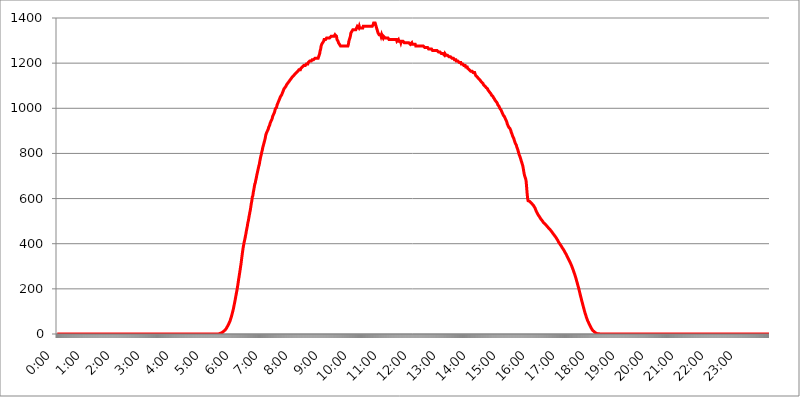
| Category | 2015.03.18. Intenzitás [W/m^2] |
|---|---|
| 0.0 | -0.256 |
| 0.0006944444444444445 | -0.256 |
| 0.001388888888888889 | -0.256 |
| 0.0020833333333333333 | -0.256 |
| 0.002777777777777778 | -0.256 |
| 0.003472222222222222 | -0.256 |
| 0.004166666666666667 | -0.256 |
| 0.004861111111111111 | -0.256 |
| 0.005555555555555556 | -0.256 |
| 0.0062499999999999995 | -0.256 |
| 0.006944444444444444 | -0.256 |
| 0.007638888888888889 | -0.256 |
| 0.008333333333333333 | -0.256 |
| 0.009027777777777779 | -0.256 |
| 0.009722222222222222 | -0.256 |
| 0.010416666666666666 | -0.256 |
| 0.011111111111111112 | -0.256 |
| 0.011805555555555555 | -0.256 |
| 0.012499999999999999 | -0.256 |
| 0.013194444444444444 | -0.256 |
| 0.013888888888888888 | -0.256 |
| 0.014583333333333332 | -0.256 |
| 0.015277777777777777 | -0.256 |
| 0.015972222222222224 | -0.256 |
| 0.016666666666666666 | -0.256 |
| 0.017361111111111112 | -0.256 |
| 0.018055555555555557 | -0.256 |
| 0.01875 | -0.256 |
| 0.019444444444444445 | -0.256 |
| 0.02013888888888889 | -0.256 |
| 0.020833333333333332 | -0.256 |
| 0.02152777777777778 | -0.256 |
| 0.022222222222222223 | -0.256 |
| 0.02291666666666667 | -0.256 |
| 0.02361111111111111 | -0.256 |
| 0.024305555555555556 | -0.256 |
| 0.024999999999999998 | -0.256 |
| 0.025694444444444447 | -0.256 |
| 0.02638888888888889 | -0.256 |
| 0.027083333333333334 | -0.256 |
| 0.027777777777777776 | -0.256 |
| 0.02847222222222222 | -0.256 |
| 0.029166666666666664 | -0.256 |
| 0.029861111111111113 | -0.256 |
| 0.030555555555555555 | -0.256 |
| 0.03125 | -0.256 |
| 0.03194444444444445 | -0.256 |
| 0.03263888888888889 | -0.256 |
| 0.03333333333333333 | -0.256 |
| 0.034027777777777775 | -0.256 |
| 0.034722222222222224 | -0.256 |
| 0.035416666666666666 | -0.256 |
| 0.036111111111111115 | -0.256 |
| 0.03680555555555556 | -0.256 |
| 0.0375 | -0.256 |
| 0.03819444444444444 | -0.256 |
| 0.03888888888888889 | -0.256 |
| 0.03958333333333333 | -0.256 |
| 0.04027777777777778 | -0.256 |
| 0.04097222222222222 | -0.256 |
| 0.041666666666666664 | -0.256 |
| 0.042361111111111106 | -0.256 |
| 0.04305555555555556 | -0.256 |
| 0.043750000000000004 | -0.256 |
| 0.044444444444444446 | -0.256 |
| 0.04513888888888889 | -0.256 |
| 0.04583333333333334 | -0.256 |
| 0.04652777777777778 | -0.256 |
| 0.04722222222222222 | -0.256 |
| 0.04791666666666666 | -0.256 |
| 0.04861111111111111 | -0.256 |
| 0.049305555555555554 | -0.256 |
| 0.049999999999999996 | -0.256 |
| 0.05069444444444445 | -0.256 |
| 0.051388888888888894 | -0.256 |
| 0.052083333333333336 | -0.256 |
| 0.05277777777777778 | -0.256 |
| 0.05347222222222222 | -0.256 |
| 0.05416666666666667 | -0.256 |
| 0.05486111111111111 | -0.256 |
| 0.05555555555555555 | -0.256 |
| 0.05625 | -0.256 |
| 0.05694444444444444 | -0.256 |
| 0.057638888888888885 | -0.256 |
| 0.05833333333333333 | -0.256 |
| 0.05902777777777778 | -0.256 |
| 0.059722222222222225 | -0.256 |
| 0.06041666666666667 | -0.256 |
| 0.061111111111111116 | -0.256 |
| 0.06180555555555556 | -0.256 |
| 0.0625 | -0.256 |
| 0.06319444444444444 | -0.256 |
| 0.06388888888888888 | -0.256 |
| 0.06458333333333334 | -0.256 |
| 0.06527777777777778 | -0.256 |
| 0.06597222222222222 | -0.256 |
| 0.06666666666666667 | -0.256 |
| 0.06736111111111111 | -0.256 |
| 0.06805555555555555 | -0.256 |
| 0.06874999999999999 | -0.256 |
| 0.06944444444444443 | -0.256 |
| 0.07013888888888889 | -0.256 |
| 0.07083333333333333 | -0.256 |
| 0.07152777777777779 | -0.256 |
| 0.07222222222222223 | -0.256 |
| 0.07291666666666667 | -0.256 |
| 0.07361111111111111 | -0.256 |
| 0.07430555555555556 | -0.256 |
| 0.075 | -0.256 |
| 0.07569444444444444 | -0.256 |
| 0.0763888888888889 | -0.256 |
| 0.07708333333333334 | -0.256 |
| 0.07777777777777778 | -0.256 |
| 0.07847222222222222 | -0.256 |
| 0.07916666666666666 | -0.256 |
| 0.0798611111111111 | -0.256 |
| 0.08055555555555556 | -0.256 |
| 0.08125 | -0.256 |
| 0.08194444444444444 | -0.256 |
| 0.08263888888888889 | -0.256 |
| 0.08333333333333333 | -0.256 |
| 0.08402777777777777 | -0.256 |
| 0.08472222222222221 | -0.256 |
| 0.08541666666666665 | -0.256 |
| 0.08611111111111112 | -0.256 |
| 0.08680555555555557 | -0.256 |
| 0.08750000000000001 | -0.256 |
| 0.08819444444444445 | -0.256 |
| 0.08888888888888889 | -0.256 |
| 0.08958333333333333 | -0.256 |
| 0.09027777777777778 | -0.256 |
| 0.09097222222222222 | -0.256 |
| 0.09166666666666667 | -0.256 |
| 0.09236111111111112 | -0.256 |
| 0.09305555555555556 | -0.256 |
| 0.09375 | -0.256 |
| 0.09444444444444444 | -0.256 |
| 0.09513888888888888 | -0.256 |
| 0.09583333333333333 | -0.256 |
| 0.09652777777777777 | -0.256 |
| 0.09722222222222222 | -0.256 |
| 0.09791666666666667 | -0.256 |
| 0.09861111111111111 | -0.256 |
| 0.09930555555555555 | -0.256 |
| 0.09999999999999999 | -0.256 |
| 0.10069444444444443 | -0.256 |
| 0.1013888888888889 | -0.256 |
| 0.10208333333333335 | -0.256 |
| 0.10277777777777779 | -0.256 |
| 0.10347222222222223 | -0.256 |
| 0.10416666666666667 | -0.256 |
| 0.10486111111111111 | -0.256 |
| 0.10555555555555556 | -0.256 |
| 0.10625 | -0.256 |
| 0.10694444444444444 | -0.256 |
| 0.1076388888888889 | -0.256 |
| 0.10833333333333334 | -0.256 |
| 0.10902777777777778 | -0.256 |
| 0.10972222222222222 | -0.256 |
| 0.1111111111111111 | -0.256 |
| 0.11180555555555556 | -0.256 |
| 0.11180555555555556 | -0.256 |
| 0.1125 | -0.256 |
| 0.11319444444444444 | -0.256 |
| 0.11388888888888889 | -0.256 |
| 0.11458333333333333 | -0.256 |
| 0.11527777777777777 | -0.256 |
| 0.11597222222222221 | -0.256 |
| 0.11666666666666665 | -0.256 |
| 0.1173611111111111 | -0.256 |
| 0.11805555555555557 | -0.256 |
| 0.11944444444444445 | -0.256 |
| 0.12013888888888889 | -0.256 |
| 0.12083333333333333 | -0.256 |
| 0.12152777777777778 | -0.256 |
| 0.12222222222222223 | -0.256 |
| 0.12291666666666667 | -0.256 |
| 0.12291666666666667 | -0.256 |
| 0.12361111111111112 | -0.256 |
| 0.12430555555555556 | -0.256 |
| 0.125 | -0.256 |
| 0.12569444444444444 | -0.256 |
| 0.12638888888888888 | -0.256 |
| 0.12708333333333333 | -0.256 |
| 0.16875 | -0.256 |
| 0.12847222222222224 | -0.256 |
| 0.12916666666666668 | -0.256 |
| 0.12986111111111112 | -0.256 |
| 0.13055555555555556 | -0.256 |
| 0.13125 | -0.256 |
| 0.13194444444444445 | -0.256 |
| 0.1326388888888889 | -0.256 |
| 0.13333333333333333 | -0.256 |
| 0.13402777777777777 | -0.256 |
| 0.13402777777777777 | -0.256 |
| 0.13472222222222222 | -0.256 |
| 0.13541666666666666 | -0.256 |
| 0.1361111111111111 | -0.256 |
| 0.13749999999999998 | -0.256 |
| 0.13819444444444443 | -0.256 |
| 0.1388888888888889 | -0.256 |
| 0.13958333333333334 | -0.256 |
| 0.14027777777777778 | -0.256 |
| 0.14097222222222222 | -0.256 |
| 0.14166666666666666 | -0.256 |
| 0.1423611111111111 | -0.256 |
| 0.14305555555555557 | -0.256 |
| 0.14375000000000002 | -0.256 |
| 0.14444444444444446 | -0.256 |
| 0.1451388888888889 | -0.256 |
| 0.1451388888888889 | -0.256 |
| 0.14652777777777778 | -0.256 |
| 0.14722222222222223 | -0.256 |
| 0.14791666666666667 | -0.256 |
| 0.1486111111111111 | -0.256 |
| 0.14930555555555555 | -0.256 |
| 0.15 | -0.256 |
| 0.15069444444444444 | -0.256 |
| 0.15138888888888888 | -0.256 |
| 0.15208333333333332 | -0.256 |
| 0.15277777777777776 | -0.256 |
| 0.15347222222222223 | -0.256 |
| 0.15416666666666667 | -0.256 |
| 0.15486111111111112 | -0.256 |
| 0.15555555555555556 | -0.256 |
| 0.15625 | -0.256 |
| 0.15694444444444444 | -0.256 |
| 0.15763888888888888 | -0.256 |
| 0.15833333333333333 | -0.256 |
| 0.15902777777777777 | -0.256 |
| 0.15972222222222224 | -0.256 |
| 0.16041666666666668 | -0.256 |
| 0.16111111111111112 | -0.256 |
| 0.16180555555555556 | -0.256 |
| 0.1625 | -0.256 |
| 0.16319444444444445 | -0.256 |
| 0.1638888888888889 | -0.256 |
| 0.16458333333333333 | -0.256 |
| 0.16527777777777777 | -0.256 |
| 0.16597222222222222 | -0.256 |
| 0.16666666666666666 | -0.256 |
| 0.1673611111111111 | -0.256 |
| 0.16805555555555554 | -0.256 |
| 0.16874999999999998 | -0.256 |
| 0.16944444444444443 | -0.256 |
| 0.17013888888888887 | -0.256 |
| 0.1708333333333333 | -0.256 |
| 0.17152777777777775 | -0.256 |
| 0.17222222222222225 | -0.256 |
| 0.1729166666666667 | -0.256 |
| 0.17361111111111113 | -0.256 |
| 0.17430555555555557 | -0.256 |
| 0.17500000000000002 | -0.256 |
| 0.17569444444444446 | -0.256 |
| 0.1763888888888889 | -0.256 |
| 0.17708333333333334 | -0.256 |
| 0.17777777777777778 | -0.256 |
| 0.17847222222222223 | -0.256 |
| 0.17916666666666667 | -0.256 |
| 0.1798611111111111 | -0.256 |
| 0.18055555555555555 | -0.256 |
| 0.18125 | -0.256 |
| 0.18194444444444444 | -0.256 |
| 0.1826388888888889 | -0.256 |
| 0.18333333333333335 | -0.256 |
| 0.1840277777777778 | -0.256 |
| 0.18472222222222223 | -0.256 |
| 0.18541666666666667 | -0.256 |
| 0.18611111111111112 | -0.256 |
| 0.18680555555555556 | -0.256 |
| 0.1875 | -0.256 |
| 0.18819444444444444 | -0.256 |
| 0.18888888888888888 | -0.256 |
| 0.18958333333333333 | -0.256 |
| 0.19027777777777777 | -0.256 |
| 0.1909722222222222 | -0.256 |
| 0.19166666666666665 | -0.256 |
| 0.19236111111111112 | -0.256 |
| 0.19305555555555554 | -0.256 |
| 0.19375 | -0.256 |
| 0.19444444444444445 | -0.256 |
| 0.1951388888888889 | -0.256 |
| 0.19583333333333333 | -0.256 |
| 0.19652777777777777 | -0.256 |
| 0.19722222222222222 | -0.256 |
| 0.19791666666666666 | -0.256 |
| 0.1986111111111111 | -0.256 |
| 0.19930555555555554 | -0.256 |
| 0.19999999999999998 | -0.256 |
| 0.20069444444444443 | -0.256 |
| 0.20138888888888887 | -0.256 |
| 0.2020833333333333 | -0.256 |
| 0.2027777777777778 | -0.256 |
| 0.2034722222222222 | -0.256 |
| 0.2041666666666667 | -0.256 |
| 0.20486111111111113 | -0.256 |
| 0.20555555555555557 | -0.256 |
| 0.20625000000000002 | -0.256 |
| 0.20694444444444446 | -0.256 |
| 0.2076388888888889 | -0.256 |
| 0.20833333333333334 | -0.256 |
| 0.20902777777777778 | -0.256 |
| 0.20972222222222223 | -0.256 |
| 0.21041666666666667 | -0.256 |
| 0.2111111111111111 | -0.256 |
| 0.21180555555555555 | -0.256 |
| 0.2125 | -0.256 |
| 0.21319444444444444 | -0.256 |
| 0.2138888888888889 | -0.256 |
| 0.21458333333333335 | -0.256 |
| 0.2152777777777778 | -0.256 |
| 0.21597222222222223 | -0.256 |
| 0.21666666666666667 | -0.256 |
| 0.21736111111111112 | -0.256 |
| 0.21805555555555556 | -0.256 |
| 0.21875 | -0.256 |
| 0.21944444444444444 | -0.256 |
| 0.22013888888888888 | -0.256 |
| 0.22083333333333333 | -0.256 |
| 0.22152777777777777 | -0.256 |
| 0.2222222222222222 | -0.256 |
| 0.22291666666666665 | -0.256 |
| 0.2236111111111111 | -0.256 |
| 0.22430555555555556 | -0.256 |
| 0.225 | -0.256 |
| 0.22569444444444445 | 1.09 |
| 0.2263888888888889 | 1.09 |
| 0.22708333333333333 | 1.09 |
| 0.22777777777777777 | 1.09 |
| 0.22847222222222222 | 2.439 |
| 0.22916666666666666 | 3.791 |
| 0.2298611111111111 | 3.791 |
| 0.23055555555555554 | 5.146 |
| 0.23124999999999998 | 6.503 |
| 0.23194444444444443 | 7.862 |
| 0.23263888888888887 | 9.225 |
| 0.2333333333333333 | 11.956 |
| 0.2340277777777778 | 13.325 |
| 0.2347222222222222 | 16.069 |
| 0.2354166666666667 | 17.444 |
| 0.23611111111111113 | 20.201 |
| 0.23680555555555557 | 22.965 |
| 0.23750000000000002 | 27.124 |
| 0.23819444444444446 | 31.297 |
| 0.2388888888888889 | 34.086 |
| 0.23958333333333334 | 38.28 |
| 0.24027777777777778 | 42.483 |
| 0.24097222222222223 | 48.1 |
| 0.24166666666666667 | 52.322 |
| 0.2423611111111111 | 57.958 |
| 0.24305555555555555 | 65.012 |
| 0.24375 | 72.069 |
| 0.24444444444444446 | 79.125 |
| 0.24513888888888888 | 87.583 |
| 0.24583333333333335 | 96.022 |
| 0.2465277777777778 | 104.435 |
| 0.24722222222222223 | 114.207 |
| 0.24791666666666667 | 125.304 |
| 0.24861111111111112 | 136.314 |
| 0.24930555555555556 | 147.223 |
| 0.25 | 159.364 |
| 0.25069444444444444 | 171.353 |
| 0.2513888888888889 | 183.184 |
| 0.2520833333333333 | 194.849 |
| 0.25277777777777777 | 207.615 |
| 0.2534722222222222 | 221.422 |
| 0.25416666666666665 | 237.433 |
| 0.2548611111111111 | 250.739 |
| 0.2555555555555556 | 265.034 |
| 0.25625000000000003 | 279.136 |
| 0.2569444444444445 | 294.255 |
| 0.2576388888888889 | 308.129 |
| 0.25833333333333336 | 325.473 |
| 0.2590277777777778 | 342.968 |
| 0.25972222222222224 | 359.595 |
| 0.2604166666666667 | 375.442 |
| 0.2611111111111111 | 389.27 |
| 0.26180555555555557 | 400.943 |
| 0.2625 | 411.638 |
| 0.26319444444444445 | 421.278 |
| 0.2638888888888889 | 432.656 |
| 0.26458333333333334 | 444.463 |
| 0.2652777777777778 | 456.747 |
| 0.2659722222222222 | 467.925 |
| 0.26666666666666666 | 479.541 |
| 0.2673611111111111 | 493.398 |
| 0.26805555555555555 | 502.396 |
| 0.26875 | 515.462 |
| 0.26944444444444443 | 527.122 |
| 0.2701388888888889 | 539.234 |
| 0.2708333333333333 | 549.691 |
| 0.27152777777777776 | 564.917 |
| 0.2722222222222222 | 578.542 |
| 0.27291666666666664 | 590.321 |
| 0.2736111111111111 | 607.495 |
| 0.2743055555555555 | 612.554 |
| 0.27499999999999997 | 628.152 |
| 0.27569444444444446 | 638.912 |
| 0.27638888888888885 | 652.786 |
| 0.27708333333333335 | 664.234 |
| 0.2777777777777778 | 670.078 |
| 0.27847222222222223 | 682.011 |
| 0.2791666666666667 | 691.18 |
| 0.2798611111111111 | 703.704 |
| 0.28055555555555556 | 713.328 |
| 0.28125 | 723.153 |
| 0.28194444444444444 | 733.184 |
| 0.2826388888888889 | 743.425 |
| 0.2833333333333333 | 750.371 |
| 0.28402777777777777 | 764.555 |
| 0.2847222222222222 | 775.451 |
| 0.28541666666666665 | 786.575 |
| 0.28611111111111115 | 794.119 |
| 0.28680555555555554 | 805.632 |
| 0.28750000000000003 | 813.439 |
| 0.2881944444444445 | 825.351 |
| 0.2888888888888889 | 829.377 |
| 0.28958333333333336 | 841.619 |
| 0.2902777777777778 | 849.92 |
| 0.29097222222222224 | 858.335 |
| 0.2916666666666667 | 866.865 |
| 0.2923611111111111 | 879.878 |
| 0.29305555555555557 | 884.274 |
| 0.29375 | 893.157 |
| 0.29444444444444445 | 893.157 |
| 0.2951388888888889 | 902.16 |
| 0.29583333333333334 | 906.707 |
| 0.2965277777777778 | 915.893 |
| 0.2972222222222222 | 920.533 |
| 0.29791666666666666 | 925.203 |
| 0.2986111111111111 | 934.639 |
| 0.29930555555555555 | 939.404 |
| 0.3 | 944.201 |
| 0.30069444444444443 | 949.03 |
| 0.3013888888888889 | 953.892 |
| 0.3020833333333333 | 963.712 |
| 0.30277777777777776 | 968.671 |
| 0.3034722222222222 | 973.663 |
| 0.30416666666666664 | 978.688 |
| 0.3048611111111111 | 983.747 |
| 0.3055555555555555 | 993.965 |
| 0.30624999999999997 | 999.125 |
| 0.3069444444444444 | 999.125 |
| 0.3076388888888889 | 1004.318 |
| 0.30833333333333335 | 1014.809 |
| 0.3090277777777778 | 1014.809 |
| 0.30972222222222223 | 1025.437 |
| 0.3104166666666667 | 1025.437 |
| 0.3111111111111111 | 1036.206 |
| 0.31180555555555556 | 1041.644 |
| 0.3125 | 1047.117 |
| 0.31319444444444444 | 1052.625 |
| 0.3138888888888889 | 1052.625 |
| 0.3145833333333333 | 1058.17 |
| 0.31527777777777777 | 1063.751 |
| 0.3159722222222222 | 1069.368 |
| 0.31666666666666665 | 1075.021 |
| 0.31736111111111115 | 1080.711 |
| 0.31805555555555554 | 1086.439 |
| 0.31875000000000003 | 1086.439 |
| 0.3194444444444445 | 1092.203 |
| 0.3201388888888889 | 1092.203 |
| 0.32083333333333336 | 1098.004 |
| 0.3215277777777778 | 1103.843 |
| 0.32222222222222224 | 1103.843 |
| 0.3229166666666667 | 1109.72 |
| 0.3236111111111111 | 1109.72 |
| 0.32430555555555557 | 1115.634 |
| 0.325 | 1115.634 |
| 0.32569444444444445 | 1121.587 |
| 0.3263888888888889 | 1121.587 |
| 0.32708333333333334 | 1127.578 |
| 0.3277777777777778 | 1127.578 |
| 0.3284722222222222 | 1133.607 |
| 0.32916666666666666 | 1133.607 |
| 0.3298611111111111 | 1139.675 |
| 0.33055555555555555 | 1139.675 |
| 0.33125 | 1139.675 |
| 0.33194444444444443 | 1145.782 |
| 0.3326388888888889 | 1145.782 |
| 0.3333333333333333 | 1151.928 |
| 0.3340277777777778 | 1151.928 |
| 0.3347222222222222 | 1151.928 |
| 0.3354166666666667 | 1158.113 |
| 0.3361111111111111 | 1158.113 |
| 0.3368055555555556 | 1158.113 |
| 0.33749999999999997 | 1164.337 |
| 0.33819444444444446 | 1164.337 |
| 0.33888888888888885 | 1170.601 |
| 0.33958333333333335 | 1170.601 |
| 0.34027777777777773 | 1170.601 |
| 0.34097222222222223 | 1170.601 |
| 0.3416666666666666 | 1176.905 |
| 0.3423611111111111 | 1176.905 |
| 0.3430555555555555 | 1176.905 |
| 0.34375 | 1183.249 |
| 0.3444444444444445 | 1183.249 |
| 0.3451388888888889 | 1183.249 |
| 0.3458333333333334 | 1189.633 |
| 0.34652777777777777 | 1189.633 |
| 0.34722222222222227 | 1189.633 |
| 0.34791666666666665 | 1189.633 |
| 0.34861111111111115 | 1189.633 |
| 0.34930555555555554 | 1196.058 |
| 0.35000000000000003 | 1196.058 |
| 0.3506944444444444 | 1196.058 |
| 0.3513888888888889 | 1196.058 |
| 0.3520833333333333 | 1202.523 |
| 0.3527777777777778 | 1202.523 |
| 0.3534722222222222 | 1202.523 |
| 0.3541666666666667 | 1209.029 |
| 0.3548611111111111 | 1209.029 |
| 0.35555555555555557 | 1209.029 |
| 0.35625 | 1209.029 |
| 0.35694444444444445 | 1209.029 |
| 0.3576388888888889 | 1215.576 |
| 0.35833333333333334 | 1215.576 |
| 0.3590277777777778 | 1215.576 |
| 0.3597222222222222 | 1215.576 |
| 0.36041666666666666 | 1215.576 |
| 0.3611111111111111 | 1215.576 |
| 0.36180555555555555 | 1222.164 |
| 0.3625 | 1222.164 |
| 0.36319444444444443 | 1222.164 |
| 0.3638888888888889 | 1222.164 |
| 0.3645833333333333 | 1222.164 |
| 0.3652777777777778 | 1222.164 |
| 0.3659722222222222 | 1222.164 |
| 0.3666666666666667 | 1228.794 |
| 0.3673611111111111 | 1228.794 |
| 0.3680555555555556 | 1242.179 |
| 0.36874999999999997 | 1255.731 |
| 0.36944444444444446 | 1262.571 |
| 0.37013888888888885 | 1276.38 |
| 0.37083333333333335 | 1283.348 |
| 0.37152777777777773 | 1283.348 |
| 0.37222222222222223 | 1290.36 |
| 0.3729166666666666 | 1290.36 |
| 0.3736111111111111 | 1297.416 |
| 0.3743055555555555 | 1304.515 |
| 0.375 | 1304.515 |
| 0.3756944444444445 | 1304.515 |
| 0.3763888888888889 | 1304.515 |
| 0.3770833333333334 | 1304.515 |
| 0.37777777777777777 | 1311.658 |
| 0.37847222222222227 | 1311.658 |
| 0.37916666666666665 | 1311.658 |
| 0.37986111111111115 | 1311.658 |
| 0.38055555555555554 | 1311.658 |
| 0.38125000000000003 | 1311.658 |
| 0.3819444444444444 | 1311.658 |
| 0.3826388888888889 | 1311.658 |
| 0.3833333333333333 | 1311.658 |
| 0.3840277777777778 | 1318.845 |
| 0.3847222222222222 | 1318.845 |
| 0.3854166666666667 | 1318.845 |
| 0.3861111111111111 | 1318.845 |
| 0.38680555555555557 | 1318.845 |
| 0.3875 | 1318.845 |
| 0.38819444444444445 | 1318.845 |
| 0.3888888888888889 | 1318.845 |
| 0.38958333333333334 | 1326.076 |
| 0.3902777777777778 | 1326.076 |
| 0.3909722222222222 | 1326.076 |
| 0.39166666666666666 | 1318.845 |
| 0.3923611111111111 | 1304.515 |
| 0.39305555555555555 | 1304.515 |
| 0.39375 | 1297.416 |
| 0.39444444444444443 | 1290.36 |
| 0.3951388888888889 | 1290.36 |
| 0.3958333333333333 | 1283.348 |
| 0.3965277777777778 | 1283.348 |
| 0.3972222222222222 | 1276.38 |
| 0.3979166666666667 | 1276.38 |
| 0.3986111111111111 | 1276.38 |
| 0.3993055555555556 | 1276.38 |
| 0.39999999999999997 | 1276.38 |
| 0.40069444444444446 | 1276.38 |
| 0.40138888888888885 | 1276.38 |
| 0.40208333333333335 | 1276.38 |
| 0.40277777777777773 | 1276.38 |
| 0.40347222222222223 | 1276.38 |
| 0.4041666666666666 | 1276.38 |
| 0.4048611111111111 | 1276.38 |
| 0.4055555555555555 | 1276.38 |
| 0.40625 | 1276.38 |
| 0.4069444444444445 | 1276.38 |
| 0.4076388888888889 | 1276.38 |
| 0.4083333333333334 | 1283.348 |
| 0.40902777777777777 | 1297.416 |
| 0.40972222222222227 | 1304.515 |
| 0.41041666666666665 | 1311.658 |
| 0.41111111111111115 | 1318.845 |
| 0.41180555555555554 | 1333.352 |
| 0.41250000000000003 | 1333.352 |
| 0.4131944444444444 | 1340.673 |
| 0.4138888888888889 | 1340.673 |
| 0.4145833333333333 | 1348.039 |
| 0.4152777777777778 | 1348.039 |
| 0.4159722222222222 | 1348.039 |
| 0.4166666666666667 | 1348.039 |
| 0.4173611111111111 | 1348.039 |
| 0.41805555555555557 | 1348.039 |
| 0.41875 | 1348.039 |
| 0.41944444444444445 | 1348.039 |
| 0.4201388888888889 | 1348.039 |
| 0.42083333333333334 | 1362.906 |
| 0.4215277777777778 | 1362.906 |
| 0.4222222222222222 | 1362.906 |
| 0.42291666666666666 | 1355.45 |
| 0.4236111111111111 | 1362.906 |
| 0.42430555555555555 | 1355.45 |
| 0.425 | 1355.45 |
| 0.42569444444444443 | 1355.45 |
| 0.4263888888888889 | 1355.45 |
| 0.4270833333333333 | 1355.45 |
| 0.4277777777777778 | 1355.45 |
| 0.4284722222222222 | 1355.45 |
| 0.4291666666666667 | 1362.906 |
| 0.4298611111111111 | 1362.906 |
| 0.4305555555555556 | 1362.906 |
| 0.43124999999999997 | 1362.906 |
| 0.43194444444444446 | 1362.906 |
| 0.43263888888888885 | 1362.906 |
| 0.43333333333333335 | 1362.906 |
| 0.43402777777777773 | 1362.906 |
| 0.43472222222222223 | 1362.906 |
| 0.4354166666666666 | 1362.906 |
| 0.4361111111111111 | 1362.906 |
| 0.4368055555555555 | 1362.906 |
| 0.4375 | 1362.906 |
| 0.4381944444444445 | 1362.906 |
| 0.4388888888888889 | 1362.906 |
| 0.4395833333333334 | 1362.906 |
| 0.44027777777777777 | 1362.906 |
| 0.44097222222222227 | 1362.906 |
| 0.44166666666666665 | 1362.906 |
| 0.44236111111111115 | 1362.906 |
| 0.44305555555555554 | 1370.408 |
| 0.44375000000000003 | 1377.956 |
| 0.4444444444444444 | 1377.956 |
| 0.4451388888888889 | 1377.956 |
| 0.4458333333333333 | 1377.956 |
| 0.4465277777777778 | 1377.956 |
| 0.4472222222222222 | 1362.906 |
| 0.4479166666666667 | 1355.45 |
| 0.4486111111111111 | 1348.039 |
| 0.44930555555555557 | 1340.673 |
| 0.45 | 1333.352 |
| 0.45069444444444445 | 1333.352 |
| 0.4513888888888889 | 1326.076 |
| 0.45208333333333334 | 1326.076 |
| 0.4527777777777778 | 1326.076 |
| 0.4534722222222222 | 1326.076 |
| 0.45416666666666666 | 1318.845 |
| 0.4548611111111111 | 1326.076 |
| 0.45555555555555555 | 1318.845 |
| 0.45625 | 1318.845 |
| 0.45694444444444443 | 1311.658 |
| 0.4576388888888889 | 1318.845 |
| 0.4583333333333333 | 1318.845 |
| 0.4590277777777778 | 1318.845 |
| 0.4597222222222222 | 1311.658 |
| 0.4604166666666667 | 1311.658 |
| 0.4611111111111111 | 1311.658 |
| 0.4618055555555556 | 1311.658 |
| 0.46249999999999997 | 1311.658 |
| 0.46319444444444446 | 1311.658 |
| 0.46388888888888885 | 1311.658 |
| 0.46458333333333335 | 1311.658 |
| 0.46527777777777773 | 1304.515 |
| 0.46597222222222223 | 1304.515 |
| 0.4666666666666666 | 1304.515 |
| 0.4673611111111111 | 1304.515 |
| 0.4680555555555555 | 1304.515 |
| 0.46875 | 1304.515 |
| 0.4694444444444445 | 1304.515 |
| 0.4701388888888889 | 1304.515 |
| 0.4708333333333334 | 1304.515 |
| 0.47152777777777777 | 1304.515 |
| 0.47222222222222227 | 1304.515 |
| 0.47291666666666665 | 1304.515 |
| 0.47361111111111115 | 1304.515 |
| 0.47430555555555554 | 1304.515 |
| 0.47500000000000003 | 1304.515 |
| 0.4756944444444444 | 1304.515 |
| 0.4763888888888889 | 1297.416 |
| 0.4770833333333333 | 1297.416 |
| 0.4777777777777778 | 1297.416 |
| 0.4784722222222222 | 1304.515 |
| 0.4791666666666667 | 1297.416 |
| 0.4798611111111111 | 1297.416 |
| 0.48055555555555557 | 1297.416 |
| 0.48125 | 1297.416 |
| 0.48194444444444445 | 1290.36 |
| 0.4826388888888889 | 1297.416 |
| 0.48333333333333334 | 1297.416 |
| 0.4840277777777778 | 1297.416 |
| 0.4847222222222222 | 1297.416 |
| 0.48541666666666666 | 1297.416 |
| 0.4861111111111111 | 1297.416 |
| 0.48680555555555555 | 1290.36 |
| 0.4875 | 1290.36 |
| 0.48819444444444443 | 1290.36 |
| 0.4888888888888889 | 1290.36 |
| 0.4895833333333333 | 1290.36 |
| 0.4902777777777778 | 1290.36 |
| 0.4909722222222222 | 1290.36 |
| 0.4916666666666667 | 1290.36 |
| 0.4923611111111111 | 1290.36 |
| 0.4930555555555556 | 1290.36 |
| 0.49374999999999997 | 1290.36 |
| 0.49444444444444446 | 1290.36 |
| 0.49513888888888885 | 1283.348 |
| 0.49583333333333335 | 1283.348 |
| 0.49652777777777773 | 1283.348 |
| 0.49722222222222223 | 1290.36 |
| 0.4979166666666666 | 1283.348 |
| 0.4986111111111111 | 1283.348 |
| 0.4993055555555555 | 1283.348 |
| 0.5 | 1283.348 |
| 0.5006944444444444 | 1283.348 |
| 0.5013888888888889 | 1283.348 |
| 0.5020833333333333 | 1283.348 |
| 0.5027777777777778 | 1276.38 |
| 0.5034722222222222 | 1276.38 |
| 0.5041666666666667 | 1276.38 |
| 0.5048611111111111 | 1276.38 |
| 0.5055555555555555 | 1276.38 |
| 0.50625 | 1276.38 |
| 0.5069444444444444 | 1276.38 |
| 0.5076388888888889 | 1276.38 |
| 0.5083333333333333 | 1276.38 |
| 0.5090277777777777 | 1276.38 |
| 0.5097222222222222 | 1276.38 |
| 0.5104166666666666 | 1276.38 |
| 0.5111111111111112 | 1276.38 |
| 0.5118055555555555 | 1276.38 |
| 0.5125000000000001 | 1276.38 |
| 0.5131944444444444 | 1276.38 |
| 0.513888888888889 | 1276.38 |
| 0.5145833333333333 | 1276.38 |
| 0.5152777777777778 | 1269.454 |
| 0.5159722222222222 | 1269.454 |
| 0.5166666666666667 | 1269.454 |
| 0.517361111111111 | 1269.454 |
| 0.5180555555555556 | 1269.454 |
| 0.5187499999999999 | 1269.454 |
| 0.5194444444444445 | 1269.454 |
| 0.5201388888888888 | 1269.454 |
| 0.5208333333333334 | 1262.571 |
| 0.5215277777777778 | 1262.571 |
| 0.5222222222222223 | 1262.571 |
| 0.5229166666666667 | 1262.571 |
| 0.5236111111111111 | 1262.571 |
| 0.5243055555555556 | 1262.571 |
| 0.525 | 1262.571 |
| 0.5256944444444445 | 1262.571 |
| 0.5263888888888889 | 1255.731 |
| 0.5270833333333333 | 1255.731 |
| 0.5277777777777778 | 1255.731 |
| 0.5284722222222222 | 1255.731 |
| 0.5291666666666667 | 1255.731 |
| 0.5298611111111111 | 1255.731 |
| 0.5305555555555556 | 1255.731 |
| 0.53125 | 1255.731 |
| 0.5319444444444444 | 1255.731 |
| 0.5326388888888889 | 1255.731 |
| 0.5333333333333333 | 1255.731 |
| 0.5340277777777778 | 1255.731 |
| 0.5347222222222222 | 1248.934 |
| 0.5354166666666667 | 1248.934 |
| 0.5361111111111111 | 1248.934 |
| 0.5368055555555555 | 1248.934 |
| 0.5375 | 1248.934 |
| 0.5381944444444444 | 1248.934 |
| 0.5388888888888889 | 1242.179 |
| 0.5395833333333333 | 1242.179 |
| 0.5402777777777777 | 1242.179 |
| 0.5409722222222222 | 1242.179 |
| 0.5416666666666666 | 1242.179 |
| 0.5423611111111112 | 1242.179 |
| 0.5430555555555555 | 1235.465 |
| 0.5437500000000001 | 1242.179 |
| 0.5444444444444444 | 1242.179 |
| 0.545138888888889 | 1235.465 |
| 0.5458333333333333 | 1235.465 |
| 0.5465277777777778 | 1235.465 |
| 0.5472222222222222 | 1235.465 |
| 0.5479166666666667 | 1235.465 |
| 0.548611111111111 | 1235.465 |
| 0.5493055555555556 | 1228.794 |
| 0.5499999999999999 | 1228.794 |
| 0.5506944444444445 | 1228.794 |
| 0.5513888888888888 | 1228.794 |
| 0.5520833333333334 | 1228.794 |
| 0.5527777777777778 | 1228.794 |
| 0.5534722222222223 | 1222.164 |
| 0.5541666666666667 | 1222.164 |
| 0.5548611111111111 | 1222.164 |
| 0.5555555555555556 | 1222.164 |
| 0.55625 | 1222.164 |
| 0.5569444444444445 | 1215.576 |
| 0.5576388888888889 | 1215.576 |
| 0.5583333333333333 | 1215.576 |
| 0.5590277777777778 | 1215.576 |
| 0.5597222222222222 | 1209.029 |
| 0.5604166666666667 | 1209.029 |
| 0.5611111111111111 | 1209.029 |
| 0.5618055555555556 | 1209.029 |
| 0.5625 | 1209.029 |
| 0.5631944444444444 | 1209.029 |
| 0.5638888888888889 | 1202.523 |
| 0.5645833333333333 | 1202.523 |
| 0.5652777777777778 | 1202.523 |
| 0.5659722222222222 | 1202.523 |
| 0.5666666666666667 | 1196.058 |
| 0.5673611111111111 | 1196.058 |
| 0.5680555555555555 | 1196.058 |
| 0.56875 | 1196.058 |
| 0.5694444444444444 | 1196.058 |
| 0.5701388888888889 | 1189.633 |
| 0.5708333333333333 | 1189.633 |
| 0.5715277777777777 | 1189.633 |
| 0.5722222222222222 | 1189.633 |
| 0.5729166666666666 | 1183.249 |
| 0.5736111111111112 | 1183.249 |
| 0.5743055555555555 | 1183.249 |
| 0.5750000000000001 | 1183.249 |
| 0.5756944444444444 | 1176.905 |
| 0.576388888888889 | 1176.905 |
| 0.5770833333333333 | 1176.905 |
| 0.5777777777777778 | 1170.601 |
| 0.5784722222222222 | 1170.601 |
| 0.5791666666666667 | 1170.601 |
| 0.579861111111111 | 1164.337 |
| 0.5805555555555556 | 1164.337 |
| 0.5812499999999999 | 1164.337 |
| 0.5819444444444445 | 1164.337 |
| 0.5826388888888888 | 1164.337 |
| 0.5833333333333334 | 1158.113 |
| 0.5840277777777778 | 1158.113 |
| 0.5847222222222223 | 1158.113 |
| 0.5854166666666667 | 1158.113 |
| 0.5861111111111111 | 1151.928 |
| 0.5868055555555556 | 1145.782 |
| 0.5875 | 1145.782 |
| 0.5881944444444445 | 1145.782 |
| 0.5888888888888889 | 1139.675 |
| 0.5895833333333333 | 1139.675 |
| 0.5902777777777778 | 1133.607 |
| 0.5909722222222222 | 1133.607 |
| 0.5916666666666667 | 1133.607 |
| 0.5923611111111111 | 1127.578 |
| 0.5930555555555556 | 1127.578 |
| 0.59375 | 1121.587 |
| 0.5944444444444444 | 1121.587 |
| 0.5951388888888889 | 1115.634 |
| 0.5958333333333333 | 1115.634 |
| 0.5965277777777778 | 1115.634 |
| 0.5972222222222222 | 1109.72 |
| 0.5979166666666667 | 1103.843 |
| 0.5986111111111111 | 1103.843 |
| 0.5993055555555555 | 1103.843 |
| 0.6 | 1098.004 |
| 0.6006944444444444 | 1098.004 |
| 0.6013888888888889 | 1092.203 |
| 0.6020833333333333 | 1092.203 |
| 0.6027777777777777 | 1092.203 |
| 0.6034722222222222 | 1086.439 |
| 0.6041666666666666 | 1080.711 |
| 0.6048611111111112 | 1080.711 |
| 0.6055555555555555 | 1075.021 |
| 0.6062500000000001 | 1075.021 |
| 0.6069444444444444 | 1069.368 |
| 0.607638888888889 | 1069.368 |
| 0.6083333333333333 | 1063.751 |
| 0.6090277777777778 | 1058.17 |
| 0.6097222222222222 | 1058.17 |
| 0.6104166666666667 | 1058.17 |
| 0.611111111111111 | 1052.625 |
| 0.6118055555555556 | 1047.117 |
| 0.6124999999999999 | 1047.117 |
| 0.6131944444444445 | 1041.644 |
| 0.6138888888888888 | 1036.206 |
| 0.6145833333333334 | 1036.206 |
| 0.6152777777777778 | 1030.804 |
| 0.6159722222222223 | 1030.804 |
| 0.6166666666666667 | 1025.437 |
| 0.6173611111111111 | 1020.106 |
| 0.6180555555555556 | 1014.809 |
| 0.61875 | 1014.809 |
| 0.6194444444444445 | 1009.546 |
| 0.6201388888888889 | 1004.318 |
| 0.6208333333333333 | 999.125 |
| 0.6215277777777778 | 999.125 |
| 0.6222222222222222 | 993.965 |
| 0.6229166666666667 | 988.839 |
| 0.6236111111111111 | 983.747 |
| 0.6243055555555556 | 978.688 |
| 0.625 | 973.663 |
| 0.6256944444444444 | 968.671 |
| 0.6263888888888889 | 968.671 |
| 0.6270833333333333 | 963.712 |
| 0.6277777777777778 | 958.785 |
| 0.6284722222222222 | 953.892 |
| 0.6291666666666667 | 949.03 |
| 0.6298611111111111 | 944.201 |
| 0.6305555555555555 | 939.404 |
| 0.63125 | 929.905 |
| 0.6319444444444444 | 925.203 |
| 0.6326388888888889 | 920.533 |
| 0.6333333333333333 | 915.893 |
| 0.6340277777777777 | 915.893 |
| 0.6347222222222222 | 911.285 |
| 0.6354166666666666 | 906.707 |
| 0.6361111111111112 | 902.16 |
| 0.6368055555555555 | 893.157 |
| 0.6375000000000001 | 888.701 |
| 0.6381944444444444 | 884.274 |
| 0.638888888888889 | 875.511 |
| 0.6395833333333333 | 871.173 |
| 0.6402777777777778 | 866.865 |
| 0.6409722222222222 | 858.335 |
| 0.6416666666666667 | 854.113 |
| 0.642361111111111 | 845.755 |
| 0.6430555555555556 | 841.619 |
| 0.6437499999999999 | 837.51 |
| 0.6444444444444445 | 829.377 |
| 0.6451388888888888 | 825.351 |
| 0.6458333333333334 | 817.382 |
| 0.6465277777777778 | 809.522 |
| 0.6472222222222223 | 801.768 |
| 0.6479166666666667 | 794.119 |
| 0.6486111111111111 | 790.334 |
| 0.6493055555555556 | 782.842 |
| 0.65 | 775.451 |
| 0.6506944444444445 | 768.162 |
| 0.6513888888888889 | 760.972 |
| 0.6520833333333333 | 753.881 |
| 0.6527777777777778 | 746.886 |
| 0.6534722222222222 | 736.574 |
| 0.6541666666666667 | 723.153 |
| 0.6548611111111111 | 710.098 |
| 0.6555555555555556 | 700.54 |
| 0.65625 | 694.278 |
| 0.6569444444444444 | 688.102 |
| 0.6576388888888889 | 676.003 |
| 0.6583333333333333 | 649.973 |
| 0.6590277777777778 | 622.881 |
| 0.6597222222222222 | 600.035 |
| 0.6604166666666667 | 590.321 |
| 0.6611111111111111 | 587.934 |
| 0.6618055555555555 | 590.321 |
| 0.6625 | 587.934 |
| 0.6631944444444444 | 585.562 |
| 0.6638888888888889 | 583.206 |
| 0.6645833333333333 | 580.866 |
| 0.6652777777777777 | 578.542 |
| 0.6659722222222222 | 576.233 |
| 0.6666666666666666 | 573.939 |
| 0.6673611111111111 | 571.661 |
| 0.6680555555555556 | 569.398 |
| 0.6687500000000001 | 564.917 |
| 0.6694444444444444 | 560.495 |
| 0.6701388888888888 | 558.305 |
| 0.6708333333333334 | 551.823 |
| 0.6715277777777778 | 547.572 |
| 0.6722222222222222 | 541.298 |
| 0.6729166666666666 | 537.182 |
| 0.6736111111111112 | 533.12 |
| 0.6743055555555556 | 529.108 |
| 0.6749999999999999 | 525.148 |
| 0.6756944444444444 | 523.186 |
| 0.6763888888888889 | 519.3 |
| 0.6770833333333334 | 515.462 |
| 0.6777777777777777 | 511.671 |
| 0.6784722222222223 | 509.793 |
| 0.6791666666666667 | 506.072 |
| 0.6798611111111111 | 504.229 |
| 0.6805555555555555 | 500.575 |
| 0.68125 | 496.965 |
| 0.6819444444444445 | 493.398 |
| 0.6826388888888889 | 491.63 |
| 0.6833333333333332 | 489.873 |
| 0.6840277777777778 | 488.126 |
| 0.6847222222222222 | 484.662 |
| 0.6854166666666667 | 482.945 |
| 0.686111111111111 | 479.541 |
| 0.6868055555555556 | 477.854 |
| 0.6875 | 474.507 |
| 0.6881944444444444 | 472.848 |
| 0.688888888888889 | 471.198 |
| 0.6895833333333333 | 467.925 |
| 0.6902777777777778 | 466.302 |
| 0.6909722222222222 | 463.083 |
| 0.6916666666666668 | 459.898 |
| 0.6923611111111111 | 458.318 |
| 0.6930555555555555 | 455.184 |
| 0.69375 | 452.082 |
| 0.6944444444444445 | 449.011 |
| 0.6951388888888889 | 445.971 |
| 0.6958333333333333 | 442.962 |
| 0.6965277777777777 | 439.982 |
| 0.6972222222222223 | 437.031 |
| 0.6979166666666666 | 434.107 |
| 0.6986111111111111 | 431.211 |
| 0.6993055555555556 | 428.341 |
| 0.7000000000000001 | 425.497 |
| 0.7006944444444444 | 421.278 |
| 0.7013888888888888 | 418.495 |
| 0.7020833333333334 | 414.364 |
| 0.7027777777777778 | 408.934 |
| 0.7034722222222222 | 404.916 |
| 0.7041666666666666 | 402.262 |
| 0.7048611111111112 | 398.318 |
| 0.7055555555555556 | 395.711 |
| 0.7062499999999999 | 391.834 |
| 0.7069444444444444 | 389.27 |
| 0.7076388888888889 | 385.455 |
| 0.7083333333333334 | 381.674 |
| 0.7090277777777777 | 379.171 |
| 0.7097222222222223 | 375.442 |
| 0.7104166666666667 | 371.742 |
| 0.7111111111111111 | 368.07 |
| 0.7118055555555555 | 364.422 |
| 0.7125 | 359.595 |
| 0.7131944444444445 | 355.999 |
| 0.7138888888888889 | 352.423 |
| 0.7145833333333332 | 347.682 |
| 0.7152777777777778 | 342.968 |
| 0.7159722222222222 | 338.278 |
| 0.7166666666666667 | 333.608 |
| 0.717361111111111 | 330.117 |
| 0.7180555555555556 | 325.473 |
| 0.71875 | 320.84 |
| 0.7194444444444444 | 316.215 |
| 0.720138888888889 | 311.594 |
| 0.7208333333333333 | 306.974 |
| 0.7215277777777778 | 301.198 |
| 0.7222222222222222 | 295.413 |
| 0.7229166666666668 | 289.616 |
| 0.7236111111111111 | 283.803 |
| 0.7243055555555555 | 276.797 |
| 0.725 | 270.931 |
| 0.7256944444444445 | 265.034 |
| 0.7263888888888889 | 257.913 |
| 0.7270833333333333 | 250.739 |
| 0.7277777777777777 | 243.507 |
| 0.7284722222222223 | 234.99 |
| 0.7291666666666666 | 227.618 |
| 0.7298611111111111 | 218.93 |
| 0.7305555555555556 | 211.405 |
| 0.7312500000000001 | 203.807 |
| 0.7319444444444444 | 194.849 |
| 0.7326388888888888 | 185.79 |
| 0.7333333333333334 | 176.631 |
| 0.7340277777777778 | 167.374 |
| 0.7347222222222222 | 159.364 |
| 0.7354166666666666 | 149.933 |
| 0.7361111111111112 | 141.782 |
| 0.7368055555555556 | 133.57 |
| 0.7374999999999999 | 125.304 |
| 0.7381944444444444 | 116.989 |
| 0.7388888888888889 | 108.629 |
| 0.7395833333333334 | 100.233 |
| 0.7402777777777777 | 93.212 |
| 0.7409722222222223 | 86.175 |
| 0.7416666666666667 | 79.125 |
| 0.7423611111111111 | 72.069 |
| 0.7430555555555555 | 66.423 |
| 0.74375 | 59.368 |
| 0.7444444444444445 | 55.139 |
| 0.7451388888888889 | 50.914 |
| 0.7458333333333332 | 45.29 |
| 0.7465277777777778 | 41.081 |
| 0.7472222222222222 | 36.881 |
| 0.7479166666666667 | 32.691 |
| 0.748611111111111 | 28.514 |
| 0.7493055555555556 | 24.35 |
| 0.75 | 20.201 |
| 0.7506944444444444 | 17.444 |
| 0.751388888888889 | 14.696 |
| 0.7520833333333333 | 11.956 |
| 0.7527777777777778 | 10.589 |
| 0.7534722222222222 | 9.225 |
| 0.7541666666666668 | 6.503 |
| 0.7548611111111111 | 6.503 |
| 0.7555555555555555 | 3.791 |
| 0.75625 | 3.791 |
| 0.7569444444444445 | 2.439 |
| 0.7576388888888889 | 1.09 |
| 0.7583333333333333 | 1.09 |
| 0.7590277777777777 | 1.09 |
| 0.7597222222222223 | 1.09 |
| 0.7604166666666666 | -0.256 |
| 0.7611111111111111 | -0.256 |
| 0.7618055555555556 | -0.256 |
| 0.7625000000000001 | -0.256 |
| 0.7631944444444444 | -0.256 |
| 0.7638888888888888 | -0.256 |
| 0.7645833333333334 | -0.256 |
| 0.7652777777777778 | -0.256 |
| 0.7659722222222222 | -0.256 |
| 0.7666666666666666 | -0.256 |
| 0.7673611111111112 | -0.256 |
| 0.7680555555555556 | -0.256 |
| 0.7687499999999999 | -0.256 |
| 0.7694444444444444 | -0.256 |
| 0.7701388888888889 | -0.256 |
| 0.7708333333333334 | -0.256 |
| 0.7715277777777777 | -0.256 |
| 0.7722222222222223 | -0.256 |
| 0.7729166666666667 | -0.256 |
| 0.7736111111111111 | -0.256 |
| 0.7743055555555555 | -0.256 |
| 0.775 | -0.256 |
| 0.7756944444444445 | -0.256 |
| 0.7763888888888889 | -0.256 |
| 0.7770833333333332 | -0.256 |
| 0.7777777777777778 | -0.256 |
| 0.7784722222222222 | -0.256 |
| 0.7791666666666667 | -0.256 |
| 0.779861111111111 | -0.256 |
| 0.7805555555555556 | -0.256 |
| 0.78125 | -0.256 |
| 0.7819444444444444 | -0.256 |
| 0.782638888888889 | -0.256 |
| 0.7833333333333333 | -0.256 |
| 0.7840277777777778 | -0.256 |
| 0.7847222222222222 | -0.256 |
| 0.7854166666666668 | -0.256 |
| 0.7861111111111111 | -0.256 |
| 0.7868055555555555 | -0.256 |
| 0.7875 | -0.256 |
| 0.7881944444444445 | -0.256 |
| 0.7888888888888889 | -0.256 |
| 0.7895833333333333 | -0.256 |
| 0.7902777777777777 | -0.256 |
| 0.7909722222222223 | -0.256 |
| 0.7916666666666666 | -0.256 |
| 0.7923611111111111 | -0.256 |
| 0.7930555555555556 | -0.256 |
| 0.7937500000000001 | -0.256 |
| 0.7944444444444444 | -0.256 |
| 0.7951388888888888 | -0.256 |
| 0.7958333333333334 | -0.256 |
| 0.7965277777777778 | -0.256 |
| 0.7972222222222222 | -0.256 |
| 0.7979166666666666 | -0.256 |
| 0.7986111111111112 | -0.256 |
| 0.7993055555555556 | -0.256 |
| 0.7999999999999999 | -0.256 |
| 0.8006944444444444 | -0.256 |
| 0.8013888888888889 | -0.256 |
| 0.8020833333333334 | -0.256 |
| 0.8027777777777777 | -0.256 |
| 0.8034722222222223 | -0.256 |
| 0.8041666666666667 | -0.256 |
| 0.8048611111111111 | -0.256 |
| 0.8055555555555555 | -0.256 |
| 0.80625 | -0.256 |
| 0.8069444444444445 | -0.256 |
| 0.8076388888888889 | -0.256 |
| 0.8083333333333332 | -0.256 |
| 0.8090277777777778 | -0.256 |
| 0.8097222222222222 | -0.256 |
| 0.8104166666666667 | -0.256 |
| 0.811111111111111 | -0.256 |
| 0.8118055555555556 | -0.256 |
| 0.8125 | -0.256 |
| 0.8131944444444444 | -0.256 |
| 0.813888888888889 | -0.256 |
| 0.8145833333333333 | -0.256 |
| 0.8152777777777778 | -0.256 |
| 0.8159722222222222 | -0.256 |
| 0.8166666666666668 | -0.256 |
| 0.8173611111111111 | -0.256 |
| 0.8180555555555555 | -0.256 |
| 0.81875 | -0.256 |
| 0.8194444444444445 | -0.256 |
| 0.8201388888888889 | -0.256 |
| 0.8208333333333333 | -0.256 |
| 0.8215277777777777 | -0.256 |
| 0.8222222222222223 | -0.256 |
| 0.8229166666666666 | -0.256 |
| 0.8236111111111111 | -0.256 |
| 0.8243055555555556 | -0.256 |
| 0.8250000000000001 | -0.256 |
| 0.8256944444444444 | -0.256 |
| 0.8263888888888888 | -0.256 |
| 0.8270833333333334 | -0.256 |
| 0.8277777777777778 | -0.256 |
| 0.8284722222222222 | -0.256 |
| 0.8291666666666666 | -0.256 |
| 0.8298611111111112 | -0.256 |
| 0.8305555555555556 | -0.256 |
| 0.8312499999999999 | -0.256 |
| 0.8319444444444444 | -0.256 |
| 0.8326388888888889 | -0.256 |
| 0.8333333333333334 | -0.256 |
| 0.8340277777777777 | -0.256 |
| 0.8347222222222223 | -0.256 |
| 0.8354166666666667 | -0.256 |
| 0.8361111111111111 | -0.256 |
| 0.8368055555555555 | -0.256 |
| 0.8375 | -0.256 |
| 0.8381944444444445 | -0.256 |
| 0.8388888888888889 | -0.256 |
| 0.8395833333333332 | -0.256 |
| 0.8402777777777778 | -0.256 |
| 0.8409722222222222 | -0.256 |
| 0.8416666666666667 | -0.256 |
| 0.842361111111111 | -0.256 |
| 0.8430555555555556 | -0.256 |
| 0.84375 | -0.256 |
| 0.8444444444444444 | -0.256 |
| 0.845138888888889 | -0.256 |
| 0.8458333333333333 | -0.256 |
| 0.8465277777777778 | -0.256 |
| 0.8472222222222222 | -0.256 |
| 0.8479166666666668 | -0.256 |
| 0.8486111111111111 | -0.256 |
| 0.8493055555555555 | -0.256 |
| 0.85 | -0.256 |
| 0.8506944444444445 | -0.256 |
| 0.8513888888888889 | -0.256 |
| 0.8520833333333333 | -0.256 |
| 0.8527777777777777 | -0.256 |
| 0.8534722222222223 | -0.256 |
| 0.8541666666666666 | -0.256 |
| 0.8548611111111111 | -0.256 |
| 0.8555555555555556 | -0.256 |
| 0.8562500000000001 | -0.256 |
| 0.8569444444444444 | -0.256 |
| 0.8576388888888888 | -0.256 |
| 0.8583333333333334 | -0.256 |
| 0.8590277777777778 | -0.256 |
| 0.8597222222222222 | -0.256 |
| 0.8604166666666666 | -0.256 |
| 0.8611111111111112 | -0.256 |
| 0.8618055555555556 | -0.256 |
| 0.8624999999999999 | -0.256 |
| 0.8631944444444444 | -0.256 |
| 0.8638888888888889 | -0.256 |
| 0.8645833333333334 | -0.256 |
| 0.8652777777777777 | -0.256 |
| 0.8659722222222223 | -0.256 |
| 0.8666666666666667 | -0.256 |
| 0.8673611111111111 | -0.256 |
| 0.8680555555555555 | -0.256 |
| 0.86875 | -0.256 |
| 0.8694444444444445 | -0.256 |
| 0.8701388888888889 | -0.256 |
| 0.8708333333333332 | -0.256 |
| 0.8715277777777778 | -0.256 |
| 0.8722222222222222 | -0.256 |
| 0.8729166666666667 | -0.256 |
| 0.873611111111111 | -0.256 |
| 0.8743055555555556 | -0.256 |
| 0.875 | -0.256 |
| 0.8756944444444444 | -0.256 |
| 0.876388888888889 | -0.256 |
| 0.8770833333333333 | -0.256 |
| 0.8777777777777778 | -0.256 |
| 0.8784722222222222 | -0.256 |
| 0.8791666666666668 | -0.256 |
| 0.8798611111111111 | -0.256 |
| 0.8805555555555555 | -0.256 |
| 0.88125 | -0.256 |
| 0.8819444444444445 | -0.256 |
| 0.8826388888888889 | -0.256 |
| 0.8833333333333333 | -0.256 |
| 0.8840277777777777 | -0.256 |
| 0.8847222222222223 | -0.256 |
| 0.8854166666666666 | -0.256 |
| 0.8861111111111111 | -0.256 |
| 0.8868055555555556 | -0.256 |
| 0.8875000000000001 | -0.256 |
| 0.8881944444444444 | -0.256 |
| 0.8888888888888888 | -0.256 |
| 0.8895833333333334 | -0.256 |
| 0.8902777777777778 | -0.256 |
| 0.8909722222222222 | -0.256 |
| 0.8916666666666666 | -0.256 |
| 0.8923611111111112 | -0.256 |
| 0.8930555555555556 | -0.256 |
| 0.8937499999999999 | -0.256 |
| 0.8944444444444444 | -0.256 |
| 0.8951388888888889 | -0.256 |
| 0.8958333333333334 | -0.256 |
| 0.8965277777777777 | -0.256 |
| 0.8972222222222223 | -0.256 |
| 0.8979166666666667 | -0.256 |
| 0.8986111111111111 | -0.256 |
| 0.8993055555555555 | -0.256 |
| 0.9 | -0.256 |
| 0.9006944444444445 | -0.256 |
| 0.9013888888888889 | -0.256 |
| 0.9020833333333332 | -0.256 |
| 0.9027777777777778 | -0.256 |
| 0.9034722222222222 | -0.256 |
| 0.9041666666666667 | -0.256 |
| 0.904861111111111 | -0.256 |
| 0.9055555555555556 | -0.256 |
| 0.90625 | -0.256 |
| 0.9069444444444444 | -0.256 |
| 0.907638888888889 | -0.256 |
| 0.9083333333333333 | -0.256 |
| 0.9090277777777778 | -0.256 |
| 0.9097222222222222 | -0.256 |
| 0.9104166666666668 | -0.256 |
| 0.9111111111111111 | -0.256 |
| 0.9118055555555555 | -0.256 |
| 0.9125 | -0.256 |
| 0.9131944444444445 | -0.256 |
| 0.9138888888888889 | -0.256 |
| 0.9145833333333333 | -0.256 |
| 0.9152777777777777 | -0.256 |
| 0.9159722222222223 | -0.256 |
| 0.9166666666666666 | -0.256 |
| 0.9173611111111111 | -0.256 |
| 0.9180555555555556 | -0.256 |
| 0.9187500000000001 | -0.256 |
| 0.9194444444444444 | -0.256 |
| 0.9201388888888888 | -0.256 |
| 0.9208333333333334 | -0.256 |
| 0.9215277777777778 | -0.256 |
| 0.9222222222222222 | -0.256 |
| 0.9229166666666666 | -0.256 |
| 0.9236111111111112 | -0.256 |
| 0.9243055555555556 | -0.256 |
| 0.9249999999999999 | -0.256 |
| 0.9256944444444444 | -0.256 |
| 0.9263888888888889 | -0.256 |
| 0.9270833333333334 | -0.256 |
| 0.9277777777777777 | -0.256 |
| 0.9284722222222223 | -0.256 |
| 0.9291666666666667 | -0.256 |
| 0.9298611111111111 | -0.256 |
| 0.9305555555555555 | -0.256 |
| 0.93125 | -0.256 |
| 0.9319444444444445 | -0.256 |
| 0.9326388888888889 | -0.256 |
| 0.9333333333333332 | -0.256 |
| 0.9340277777777778 | -0.256 |
| 0.9347222222222222 | -0.256 |
| 0.9354166666666667 | -0.256 |
| 0.936111111111111 | -0.256 |
| 0.9368055555555556 | -0.256 |
| 0.9375 | -0.256 |
| 0.9381944444444444 | -0.256 |
| 0.938888888888889 | -0.256 |
| 0.9395833333333333 | -0.256 |
| 0.9402777777777778 | -0.256 |
| 0.9409722222222222 | -0.256 |
| 0.9416666666666668 | -0.256 |
| 0.9423611111111111 | -0.256 |
| 0.9430555555555555 | -0.256 |
| 0.94375 | -0.256 |
| 0.9444444444444445 | -0.256 |
| 0.9451388888888889 | -0.256 |
| 0.9458333333333333 | -0.256 |
| 0.9465277777777777 | -0.256 |
| 0.9472222222222223 | -0.256 |
| 0.9479166666666666 | -0.256 |
| 0.9486111111111111 | -0.256 |
| 0.9493055555555556 | -0.256 |
| 0.9500000000000001 | -0.256 |
| 0.9506944444444444 | -0.256 |
| 0.9513888888888888 | -0.256 |
| 0.9520833333333334 | -0.256 |
| 0.9527777777777778 | -0.256 |
| 0.9534722222222222 | -0.256 |
| 0.9541666666666666 | -0.256 |
| 0.9548611111111112 | -0.256 |
| 0.9555555555555556 | -0.256 |
| 0.9562499999999999 | -0.256 |
| 0.9569444444444444 | -0.256 |
| 0.9576388888888889 | -0.256 |
| 0.9583333333333334 | -0.256 |
| 0.9590277777777777 | -0.256 |
| 0.9597222222222223 | -0.256 |
| 0.9604166666666667 | -0.256 |
| 0.9611111111111111 | -0.256 |
| 0.9618055555555555 | -0.256 |
| 0.9625 | -0.256 |
| 0.9631944444444445 | -0.256 |
| 0.9638888888888889 | -0.256 |
| 0.9645833333333332 | -0.256 |
| 0.9652777777777778 | -0.256 |
| 0.9659722222222222 | -0.256 |
| 0.9666666666666667 | -0.256 |
| 0.967361111111111 | -0.256 |
| 0.9680555555555556 | -0.256 |
| 0.96875 | -0.256 |
| 0.9694444444444444 | -0.256 |
| 0.970138888888889 | -0.256 |
| 0.9708333333333333 | -0.256 |
| 0.9715277777777778 | -0.256 |
| 0.9722222222222222 | -0.256 |
| 0.9729166666666668 | -0.256 |
| 0.9736111111111111 | -0.256 |
| 0.9743055555555555 | -0.256 |
| 0.975 | -0.256 |
| 0.9756944444444445 | -0.256 |
| 0.9763888888888889 | -0.256 |
| 0.9770833333333333 | -0.256 |
| 0.9777777777777777 | -0.256 |
| 0.9784722222222223 | -0.256 |
| 0.9791666666666666 | -0.256 |
| 0.9798611111111111 | -0.256 |
| 0.9805555555555556 | -0.256 |
| 0.9812500000000001 | -0.256 |
| 0.9819444444444444 | -0.256 |
| 0.9826388888888888 | -0.256 |
| 0.9833333333333334 | -0.256 |
| 0.9840277777777778 | -0.256 |
| 0.9847222222222222 | -0.256 |
| 0.9854166666666666 | -0.256 |
| 0.9861111111111112 | -0.256 |
| 0.9868055555555556 | -0.256 |
| 0.9874999999999999 | -0.256 |
| 0.9881944444444444 | -0.256 |
| 0.9888888888888889 | -0.256 |
| 0.9895833333333334 | -0.256 |
| 0.9902777777777777 | -0.256 |
| 0.9909722222222223 | -0.256 |
| 0.9916666666666667 | -0.256 |
| 0.9923611111111111 | -0.256 |
| 0.9930555555555555 | -0.256 |
| 0.99375 | -0.256 |
| 0.9944444444444445 | -0.256 |
| 0.9951388888888889 | -0.256 |
| 0.9958333333333332 | -0.256 |
| 0.9965277777777778 | -0.256 |
| 0.9972222222222222 | -0.256 |
| 0.9979166666666667 | -0.256 |
| 0.998611111111111 | -0.256 |
| 0.9993055555555556 | 0 |